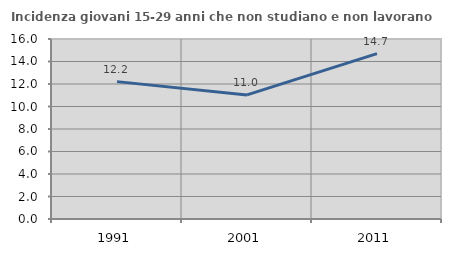
| Category | Incidenza giovani 15-29 anni che non studiano e non lavorano  |
|---|---|
| 1991.0 | 12.211 |
| 2001.0 | 11.029 |
| 2011.0 | 14.701 |